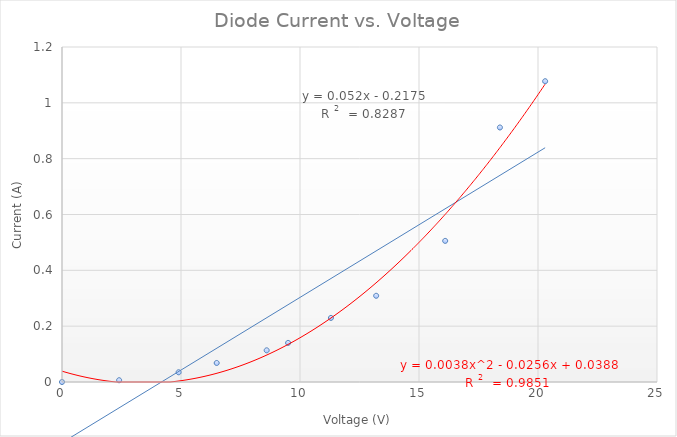
| Category | Series 0 |
|---|---|
| 2.4 | 0.006 |
| 4.9 | 0.035 |
| 6.5 | 0.068 |
| 8.6 | 0.113 |
| 9.5 | 0.14 |
| 11.3 | 0.23 |
| 13.2 | 0.309 |
| 16.1 | 0.505 |
| 18.4 | 0.912 |
| 20.3 | 1.077 |
| 0.0 | 0 |